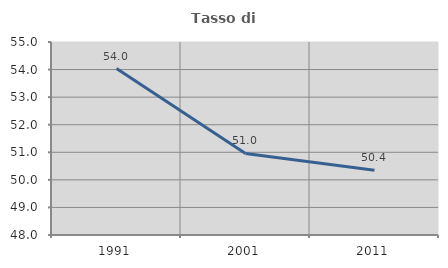
| Category | Tasso di occupazione   |
|---|---|
| 1991.0 | 54.036 |
| 2001.0 | 50.957 |
| 2011.0 | 50.35 |